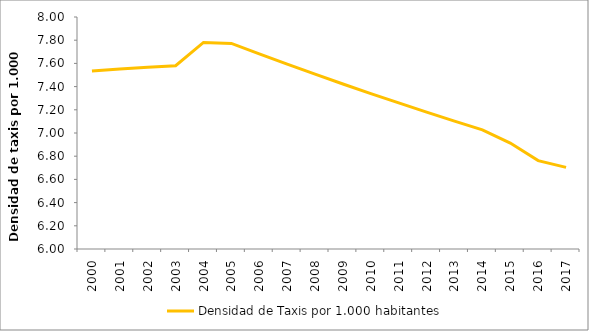
| Category | Densidad de Taxis por 1.000 habitantes |
|---|---|
| 2000.0 | 7.535 |
| 2001.0 | 7.551 |
| 2002.0 | 7.567 |
| 2003.0 | 7.58 |
| 2004.0 | 7.781 |
| 2005.0 | 7.772 |
| 2006.0 | 7.682 |
| 2007.0 | 7.593 |
| 2008.0 | 7.507 |
| 2009.0 | 7.423 |
| 2010.0 | 7.34 |
| 2011.0 | 7.259 |
| 2012.0 | 7.18 |
| 2013.0 | 7.103 |
| 2014.0 | 7.027 |
| 2015.0 | 6.914 |
| 2016.0 | 6.762 |
| 2017.0 | 6.704 |